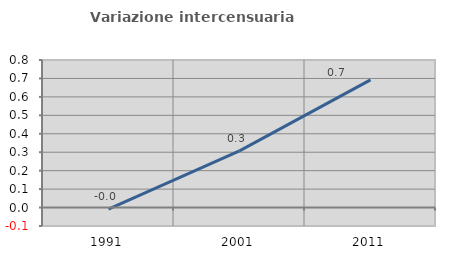
| Category | Variazione intercensuaria annua |
|---|---|
| 1991.0 | -0.008 |
| 2001.0 | 0.307 |
| 2011.0 | 0.692 |